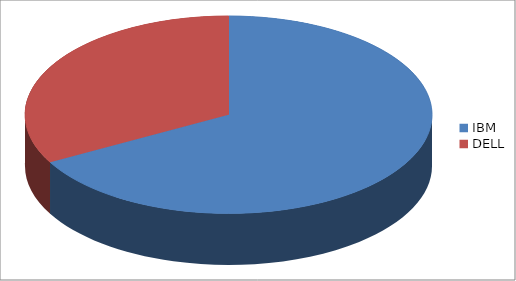
| Category | Series 0 |
|---|---|
| IBM | 0.67 |
| DELL | 0.33 |